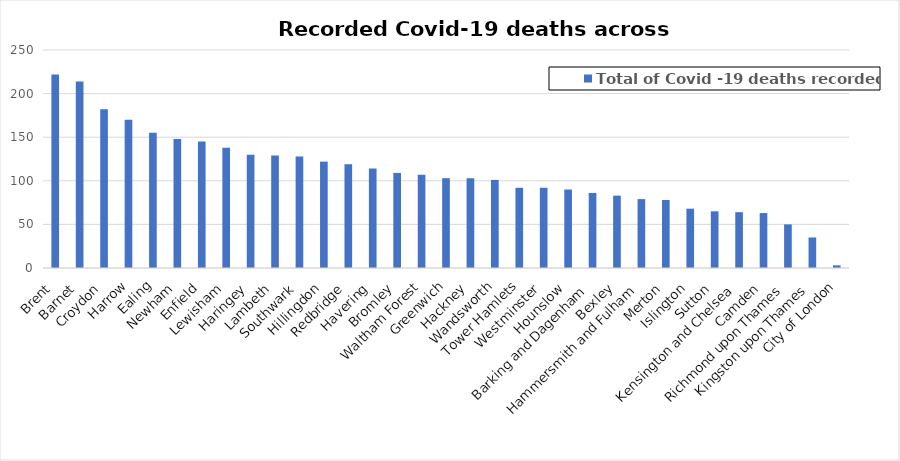
| Category | Total of Covid -19 deaths recorded |
|---|---|
| Brent | 222 |
| Barnet | 214 |
| Croydon | 182 |
| Harrow | 170 |
| Ealing | 155 |
| Newham | 148 |
| Enfield | 145 |
| Lewisham | 138 |
| Haringey | 130 |
| Lambeth | 129 |
| Southwark | 128 |
| Hillingdon | 122 |
| Redbridge | 119 |
| Havering | 114 |
| Bromley | 109 |
| Waltham Forest | 107 |
| Greenwich | 103 |
| Hackney | 103 |
| Wandsworth | 101 |
| Tower Hamlets | 92 |
| Westminster | 92 |
| Hounslow | 90 |
| Barking and Dagenham | 86 |
| Bexley | 83 |
| Hammersmith and Fulham | 79 |
| Merton | 78 |
| Islington | 68 |
| Sutton | 65 |
| Kensington and Chelsea | 64 |
| Camden | 63 |
| Richmond upon Thames | 50 |
| Kingston upon Thames | 35 |
| City of London | 3 |